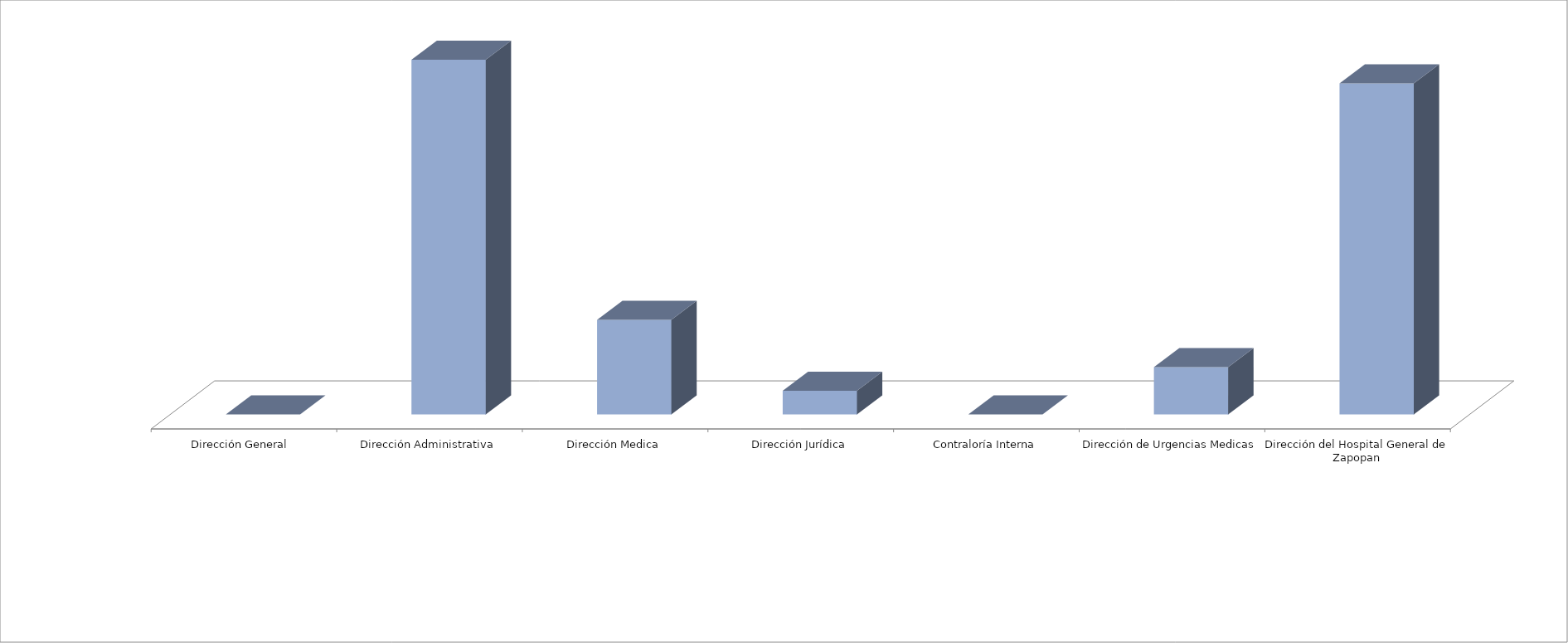
| Category | Series 0 | Series 1 |
|---|---|---|
| Dirección General  |  | 0 |
| Dirección Administrativa |  | 15 |
| Dirección Medica |  | 4 |
| Dirección Jurídica |  | 1 |
| Contraloría Interna |  | 0 |
| Dirección de Urgencias Medicas |  | 2 |
| Dirección del Hospital General de Zapopan |  | 14 |